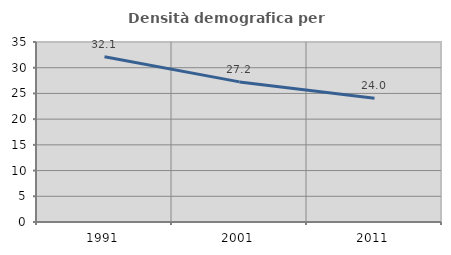
| Category | Densità demografica |
|---|---|
| 1991.0 | 32.145 |
| 2001.0 | 27.244 |
| 2011.0 | 24.042 |